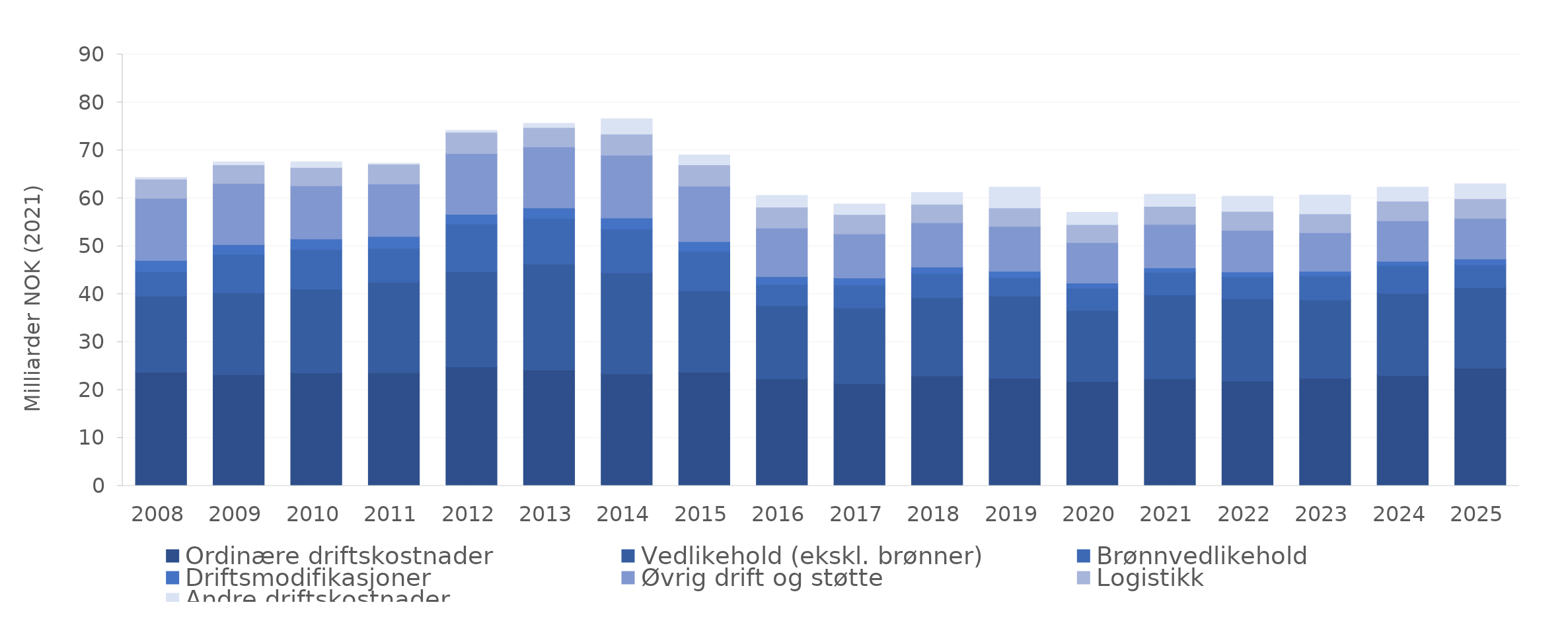
| Category | Ordinære driftskostnader | Vedlikehold (ekskl. brønner) | Brønnvedlikehold | Driftsmodifikasjoner | Øvrig drift og støtte | Logistikk | Andre driftskostnader |
|---|---|---|---|---|---|---|---|
| 2008.0 | 23.717 | 15.878 | 5.104 | 2.341 | 12.949 | 4.041 | 0.344 |
| 2009.0 | 23.226 | 17.006 | 8.031 | 2.067 | 12.763 | 3.879 | 0.641 |
| 2010.0 | 23.578 | 17.472 | 8.246 | 2.226 | 11.084 | 3.832 | 1.183 |
| 2011.0 | 23.616 | 18.876 | 7.058 | 2.492 | 10.952 | 4.139 | 0.207 |
| 2012.0 | 24.818 | 19.88 | 9.902 | 2.063 | 12.662 | 4.449 | 0.402 |
| 2013.0 | 24.142 | 22.126 | 9.502 | 2.233 | 12.709 | 4.057 | 0.861 |
| 2014.0 | 23.37 | 21.077 | 9.096 | 2.334 | 13.106 | 4.396 | 3.21 |
| 2015.0 | 23.708 | 16.996 | 8.21 | 2.046 | 11.564 | 4.45 | 2.083 |
| 2016.0 | 22.323 | 15.256 | 4.414 | 1.654 | 10.151 | 4.372 | 2.45 |
| 2017.0 | 21.343 | 15.782 | 4.788 | 1.484 | 9.183 | 4.022 | 2.207 |
| 2018.0 | 22.942 | 16.321 | 5.026 | 1.379 | 9.212 | 3.858 | 2.489 |
| 2019.0 | 22.435 | 17.142 | 3.848 | 1.343 | 9.351 | 3.887 | 4.342 |
| 2020.0 | 21.794 | 14.793 | 4.651 | 1.074 | 8.438 | 3.758 | 2.546 |
| 2021.0 | 22.317 | 17.5 | 4.745 | 0.916 | 9.073 | 3.757 | 2.538 |
| 2022.0 | 21.868 | 17.133 | 4.619 | 0.99 | 8.709 | 3.96 | 3.155 |
| 2023.0 | 22.445 | 16.34 | 5.019 | 0.944 | 8.061 | 3.938 | 3.915 |
| 2024.0 | 23.005 | 17.167 | 5.745 | 0.956 | 8.415 | 4.114 | 2.946 |
| 2025.0 | 24.552 | 16.819 | 4.718 | 1.259 | 8.457 | 4.101 | 3.106 |